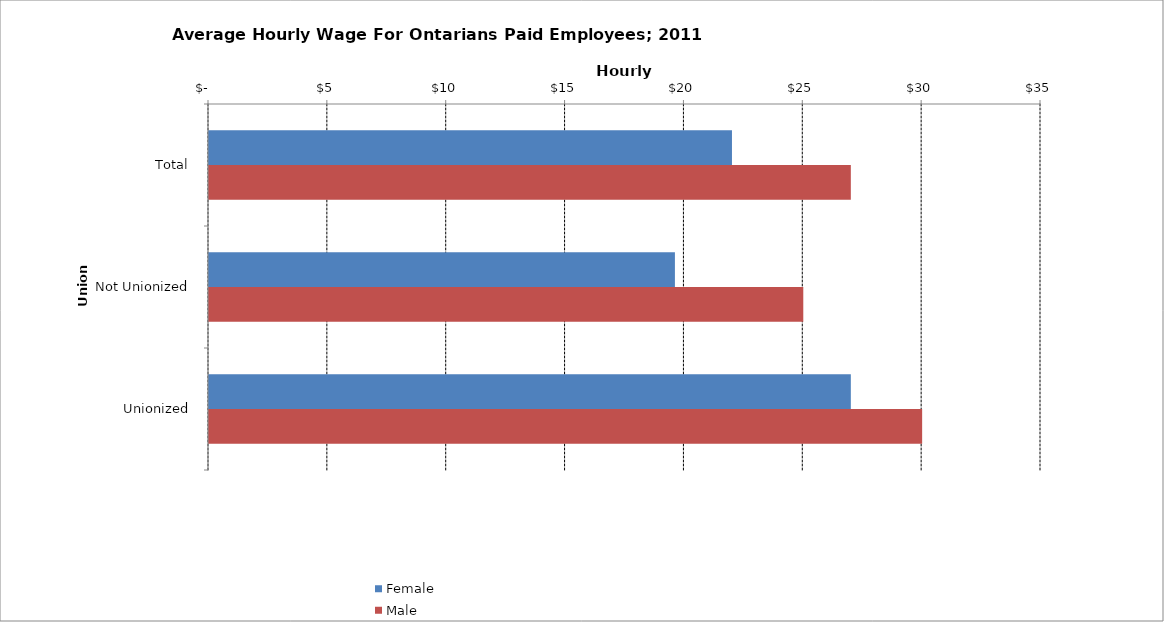
| Category | Female | Male |
|---|---|---|
| Total | 22 | 27 |
|  Not Unionized  | 19.6 | 25 |
|  Unionized  | 27 | 30 |